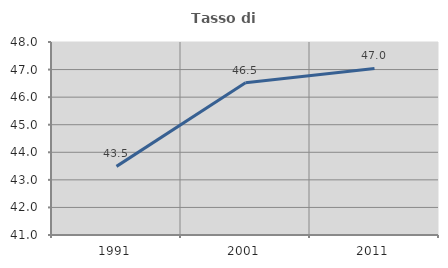
| Category | Tasso di occupazione   |
|---|---|
| 1991.0 | 43.489 |
| 2001.0 | 46.523 |
| 2011.0 | 47.041 |